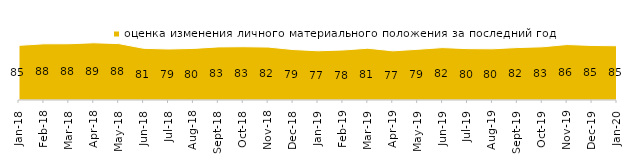
| Category | оценка изменения личного материального положения за последний год |
|---|---|
| 2018-01-01 | 85.15 |
| 2018-02-01 | 87.55 |
| 2018-03-01 | 87.65 |
| 2018-04-01 | 89.15 |
| 2018-05-01 | 87.9 |
| 2018-06-01 | 80.55 |
| 2018-07-01 | 79.45 |
| 2018-08-01 | 80.4 |
| 2018-09-01 | 82.75 |
| 2018-10-01 | 83.05 |
| 2018-11-01 | 82.485 |
| 2018-12-01 | 78.65 |
| 2019-01-01 | 76.7 |
| 2019-02-01 | 77.9 |
| 2019-03-01 | 80.656 |
| 2019-04-01 | 76.584 |
| 2019-05-01 | 79 |
| 2019-06-01 | 81.696 |
| 2019-07-01 | 80.05 |
| 2019-08-01 | 79.77 |
| 2019-09-01 | 81.733 |
| 2019-10-01 | 82.871 |
| 2019-11-01 | 86.436 |
| 2019-12-01 | 85 |
| 2020-01-01 | 84.505 |